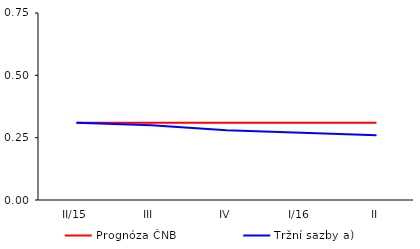
| Category | Prognóza ČNB | Tržní sazby a) |
|---|---|---|
| II/15 | 0.31 | 0.31 |
| III | 0.31 | 0.3 |
| IV | 0.31 | 0.28 |
| I/16 | 0.31 | 0.27 |
| II | 0.31 | 0.26 |